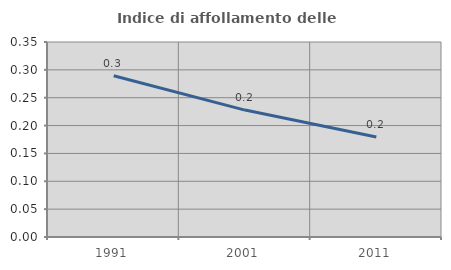
| Category | Indice di affollamento delle abitazioni  |
|---|---|
| 1991.0 | 0.289 |
| 2001.0 | 0.228 |
| 2011.0 | 0.18 |